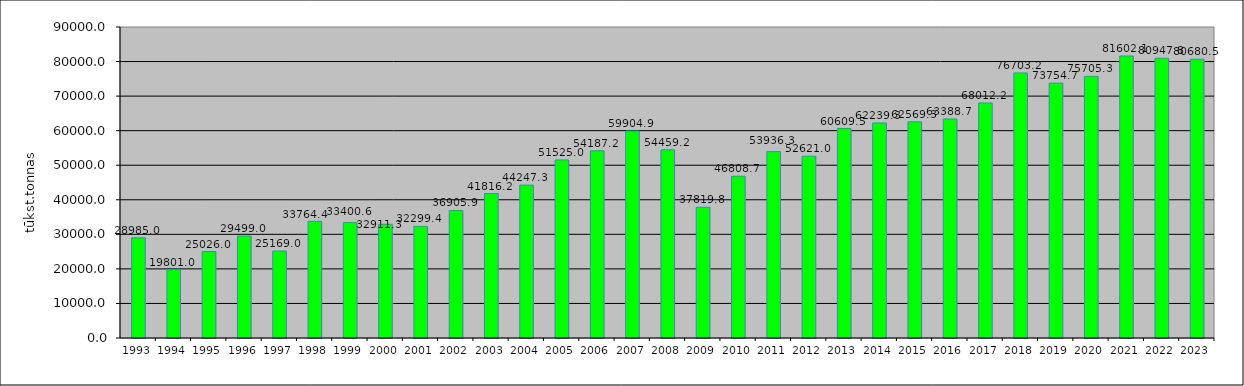
| Category | Series 0 |
|---|---|
| 1993.0 | 28985 |
| 1994.0 | 19801 |
| 1995.0 | 25026 |
| 1996.0 | 29499 |
| 1997.0 | 25169 |
| 1998.0 | 33764.4 |
| 1999.0 | 33400.6 |
| 2000.0 | 32911.3 |
| 2001.0 | 32299.4 |
| 2002.0 | 36905.9 |
| 2003.0 | 41816.2 |
| 2004.0 | 44247.3 |
| 2005.0 | 51525 |
| 2006.0 | 54187.2 |
| 2007.0 | 59904.9 |
| 2008.0 | 54459.2 |
| 2009.0 | 37819.8 |
| 2010.0 | 46808.7 |
| 2011.0 | 53936.3 |
| 2012.0 | 52621 |
| 2013.0 | 60609.5 |
| 2014.0 | 62239.3 |
| 2015.0 | 62569.3 |
| 2016.0 | 63388.7 |
| 2017.0 | 68012.2 |
| 2018.0 | 76703.2 |
| 2019.0 | 73754.7 |
| 2020.0 | 75705.3 |
| 2021.0 | 81602.1 |
| 2022.0 | 80947.8 |
| 2023.0 | 80680.5 |